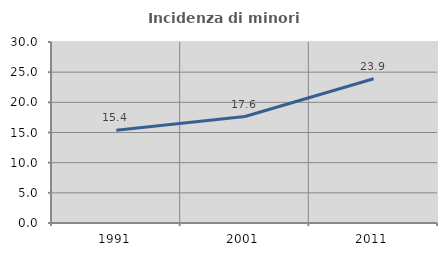
| Category | Incidenza di minori stranieri |
|---|---|
| 1991.0 | 15.385 |
| 2001.0 | 17.647 |
| 2011.0 | 23.913 |